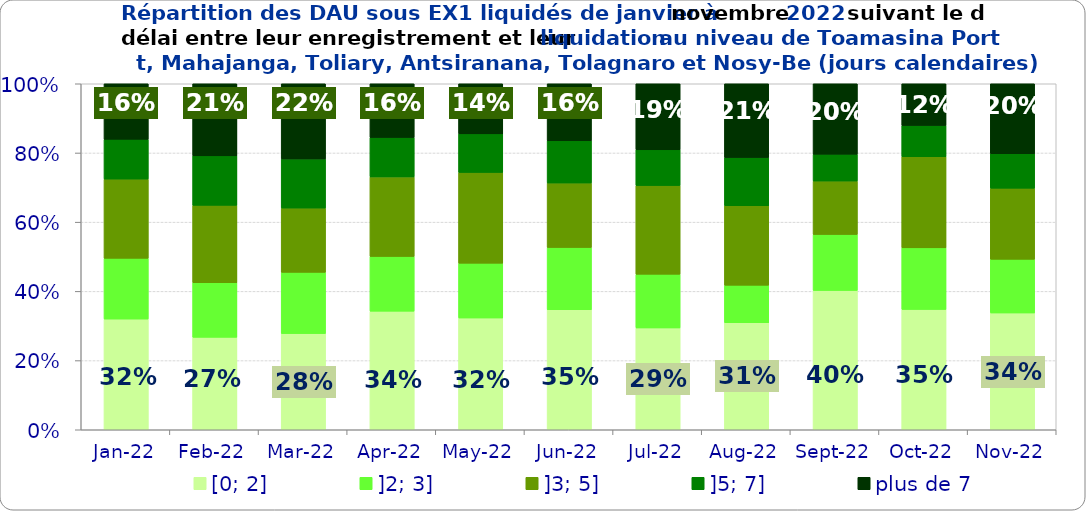
| Category | [0; 2] | ]2; 3] | ]3; 5] | ]5; 7] | plus de 7 |
|---|---|---|---|---|---|
| 2022-01-01 | 0.32 | 0.176 | 0.229 | 0.115 | 0.161 |
| 2022-02-01 | 0.267 | 0.158 | 0.223 | 0.143 | 0.208 |
| 2022-03-01 | 0.278 | 0.177 | 0.186 | 0.142 | 0.217 |
| 2022-04-01 | 0.343 | 0.158 | 0.23 | 0.114 | 0.155 |
| 2022-05-01 | 0.323 | 0.158 | 0.262 | 0.111 | 0.145 |
| 2022-06-01 | 0.347 | 0.18 | 0.186 | 0.122 | 0.165 |
| 2022-07-01 | 0.294 | 0.155 | 0.256 | 0.103 | 0.191 |
| 2022-08-01 | 0.309 | 0.108 | 0.23 | 0.139 | 0.213 |
| 2022-09-01 | 0.403 | 0.162 | 0.154 | 0.078 | 0.204 |
| 2022-10-01 | 0.348 | 0.178 | 0.263 | 0.09 | 0.121 |
| 2022-11-01 | 0.338 | 0.155 | 0.205 | 0.1 | 0.202 |